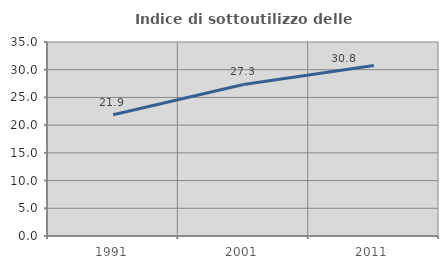
| Category | Indice di sottoutilizzo delle abitazioni  |
|---|---|
| 1991.0 | 21.884 |
| 2001.0 | 27.336 |
| 2011.0 | 30.769 |